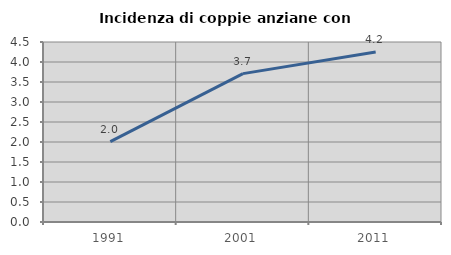
| Category | Incidenza di coppie anziane con figli |
|---|---|
| 1991.0 | 2.008 |
| 2001.0 | 3.71 |
| 2011.0 | 4.249 |